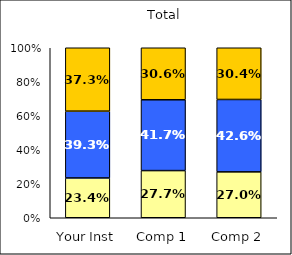
| Category | Low Leadership | Average Leadership | High Leadership |
|---|---|---|---|
| Your Inst | 0.234 | 0.393 | 0.373 |
| Comp 1 | 0.277 | 0.417 | 0.306 |
| Comp 2 | 0.27 | 0.426 | 0.304 |